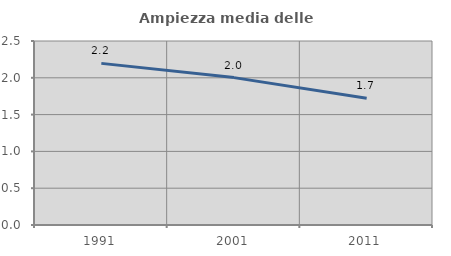
| Category | Ampiezza media delle famiglie |
|---|---|
| 1991.0 | 2.196 |
| 2001.0 | 2.002 |
| 2011.0 | 1.721 |